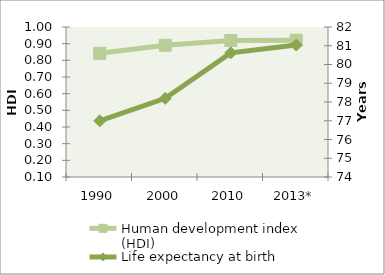
| Category | Human development index (HDI) |
|---|---|
| 1990 | 0.842 |
| 2000 | 0.891 |
| 2010 | 0.919 |
| 2013* | 0.921 |